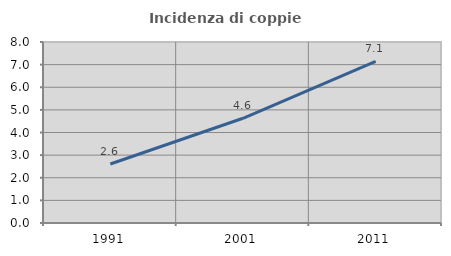
| Category | Incidenza di coppie miste |
|---|---|
| 1991.0 | 2.609 |
| 2001.0 | 4.63 |
| 2011.0 | 7.143 |